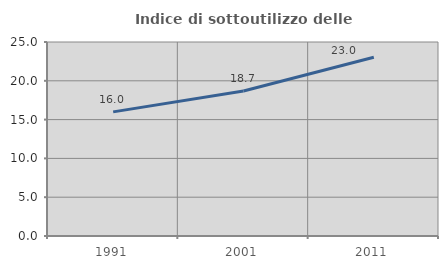
| Category | Indice di sottoutilizzo delle abitazioni  |
|---|---|
| 1991.0 | 15.996 |
| 2001.0 | 18.691 |
| 2011.0 | 23.04 |